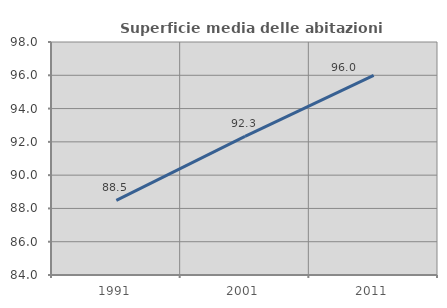
| Category | Superficie media delle abitazioni occupate |
|---|---|
| 1991.0 | 88.488 |
| 2001.0 | 92.332 |
| 2011.0 | 95.996 |